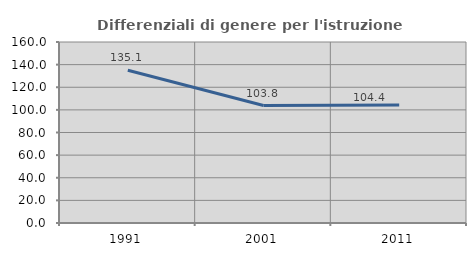
| Category | Differenziali di genere per l'istruzione superiore |
|---|---|
| 1991.0 | 135.057 |
| 2001.0 | 103.809 |
| 2011.0 | 104.404 |